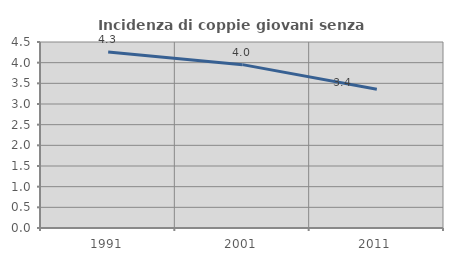
| Category | Incidenza di coppie giovani senza figli |
|---|---|
| 1991.0 | 4.255 |
| 2001.0 | 3.952 |
| 2011.0 | 3.356 |